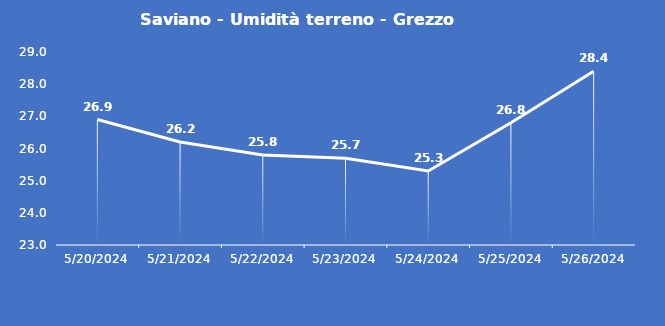
| Category | Saviano - Umidità terreno - Grezzo (%VWC) |
|---|---|
| 5/20/24 | 26.9 |
| 5/21/24 | 26.2 |
| 5/22/24 | 25.8 |
| 5/23/24 | 25.7 |
| 5/24/24 | 25.3 |
| 5/25/24 | 26.8 |
| 5/26/24 | 28.4 |